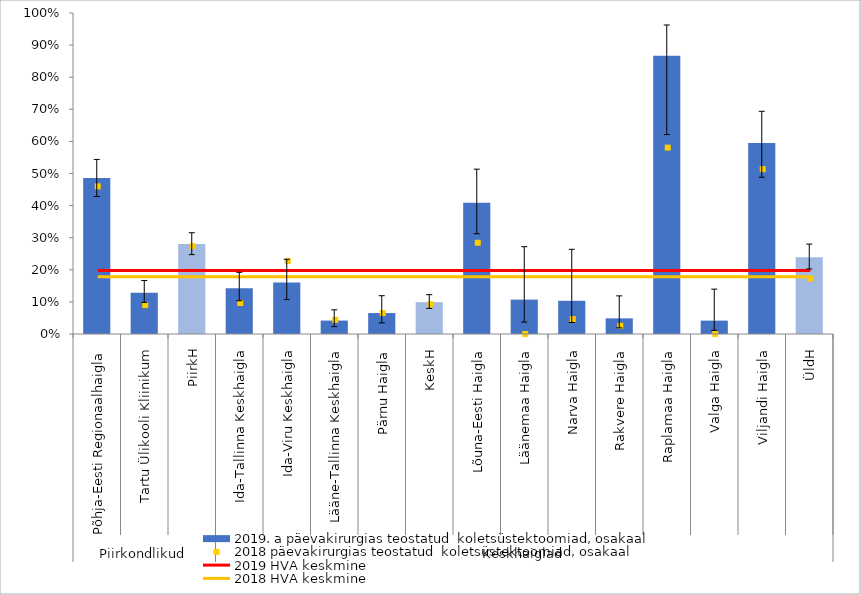
| Category | 2019. a päevakirurgias teostatud  koletsüstektoomiad, osakaal |
|---|---|
| 0 | 0.486 |
| 1 | 0.129 |
| 2 | 0.28 |
| 3 | 0.142 |
| 4 | 0.16 |
| 5 | 0.042 |
| 6 | 0.065 |
| 7 | 0.099 |
| 8 | 0.409 |
| 9 | 0.107 |
| 10 | 0.103 |
| 11 | 0.049 |
| 12 | 0.867 |
| 13 | 0.042 |
| 14 | 0.595 |
| 15 | 0.239 |